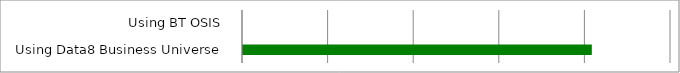
| Category | Series 0 |
|---|---|
|  Using BT OSIS  | 0 |
|  Using Data8 Business Universe  | 4075 |